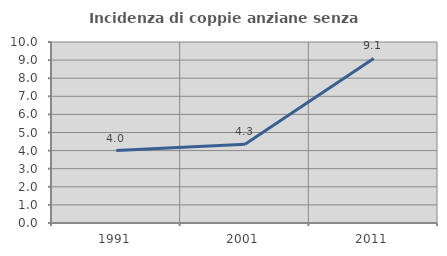
| Category | Incidenza di coppie anziane senza figli  |
|---|---|
| 1991.0 | 4 |
| 2001.0 | 4.348 |
| 2011.0 | 9.091 |